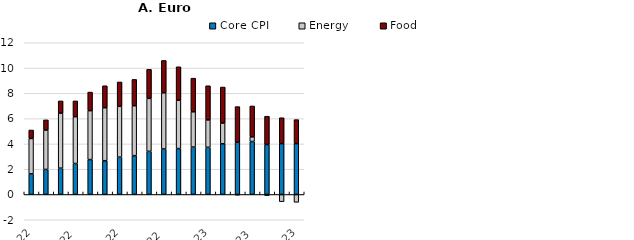
| Category | Core CPI | Energy | Food |
|---|---|---|---|
| 2022-01-01 | 1.63 | 2.8 | 0.67 |
| 2022-02-01 | 1.98 | 3.12 | 0.8 |
| 2022-03-01 | 2.08 | 4.35 | 0.97 |
| 2022-04-01 | 2.45 | 3.7 | 1.25 |
| 2022-05-01 | 2.76 | 3.87 | 1.47 |
| 2022-06-01 | 2.67 | 4.19 | 1.74 |
| 2022-07-01 | 2.95 | 4.02 | 1.93 |
| 2022-08-01 | 3.07 | 3.95 | 2.08 |
| 2022-09-01 | 3.41 | 4.19 | 2.3 |
| 2022-10-01 | 3.6 | 4.44 | 2.56 |
| 2022-11-01 | 3.63 | 3.82 | 2.65 |
| 2022-12-01 | 3.75 | 2.79 | 2.66 |
| 2023-01-01 | 3.73 | 2.17 | 2.7 |
| 2023-02-01 | 4.01 | 1.64 | 2.85 |
| 2023-03-01 | 4.13 | -0.05 | 2.82 |
| 2023-04-01 | 4.19 | 0.37 | 2.44 |
| 2023-05-01 | 3.95 | -0.09 | 2.24 |
| 2023-06-01 | 4.02 | -0.57 | 2.05 |
| 2023-07-01 | 4.02 | -0.62 | 1.9 |